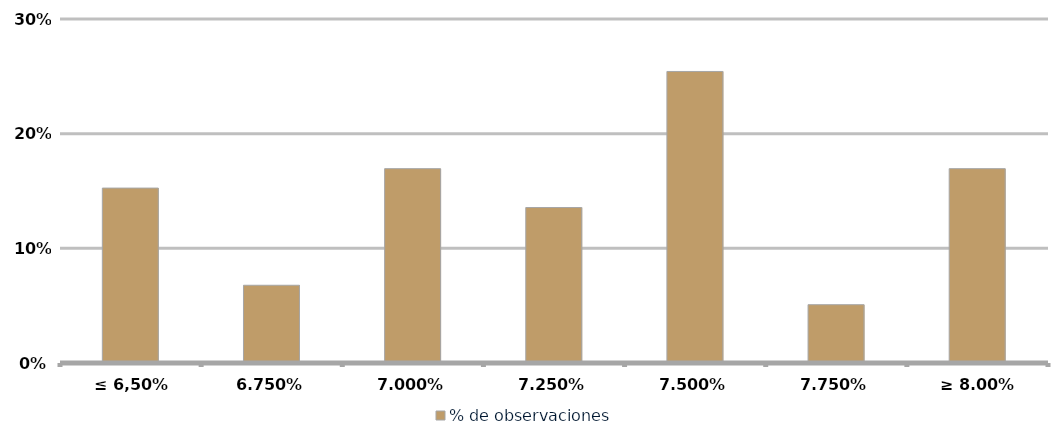
| Category | % de observaciones  |
|---|---|
| ≤ 6,50% | 0.153 |
| 6,75% | 0.068 |
| 7,00% | 0.169 |
| 7,25% | 0.136 |
| 7,50% | 0.254 |
| 7,75% | 0.051 |
| ≥ 8.00% | 0.169 |